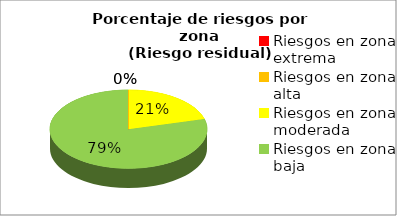
| Category | Series 0 | Series 1 |
|---|---|---|
| Riesgos en zona extrema | 0 | 0 |
| Riesgos en zona alta | 0 | 0 |
| Riesgos en zona moderada | 5 | 0.208 |
| Riesgos en zona baja | 19 | 0.792 |